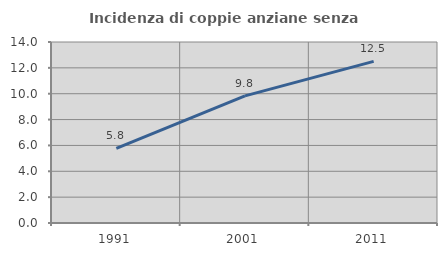
| Category | Incidenza di coppie anziane senza figli  |
|---|---|
| 1991.0 | 5.769 |
| 2001.0 | 9.836 |
| 2011.0 | 12.5 |